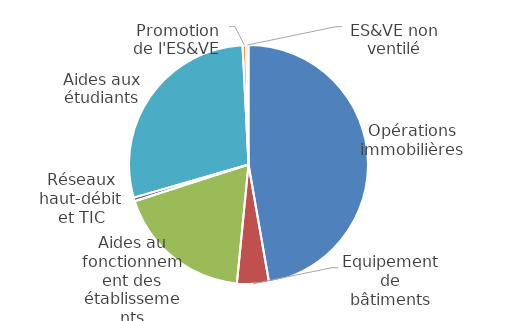
| Category | Opérations immobilières |
|---|---|
| Opérations immobilières | 0.473 |
| Equipement de bâtiments | 0.043 |
| Aides au fonctionnement des établissements | 0.185 |
| Réseaux haut-débit et TIC | 0.005 |
| Aides aux étudiants | 0.287 |
| Promotion de l'ES&VE | 0.005 |
| ES&VE non ventilé | 0.003 |